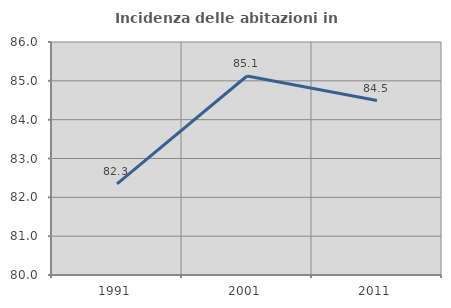
| Category | Incidenza delle abitazioni in proprietà  |
|---|---|
| 1991.0 | 82.345 |
| 2001.0 | 85.125 |
| 2011.0 | 84.493 |